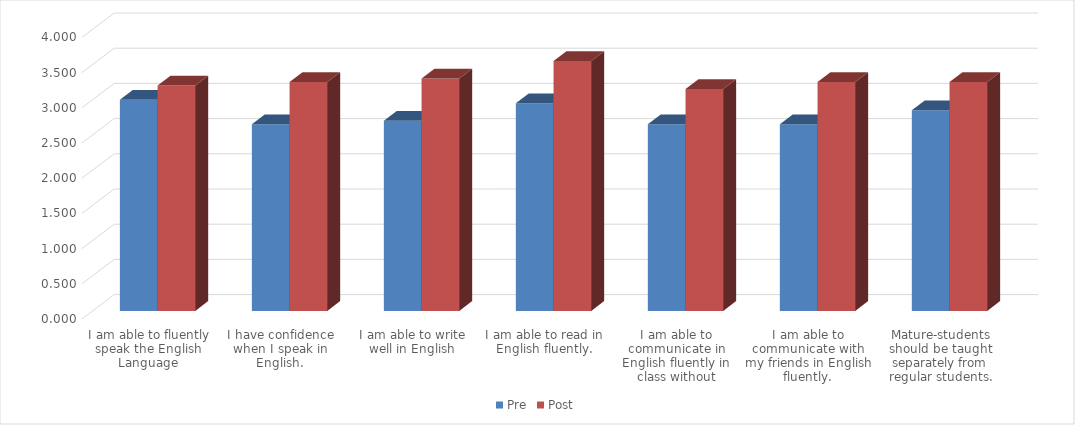
| Category | Pre | Post |
|---|---|---|
| I am able to fluently speak the English Language | 3 | 3.2 |
| I have confidence when I speak in English. | 2.65 | 3.25 |
| I am able to write well in English | 2.7 | 3.3 |
| I am able to read in English fluently. | 2.95 | 3.55 |
| I am able to communicate in English fluently in class without difficulty. | 2.65 | 3.15 |
| I am able to communicate with my friends in English fluently. | 2.65 | 3.25 |
| Mature-students should be taught separately from regular students. | 2.85 | 3.25 |